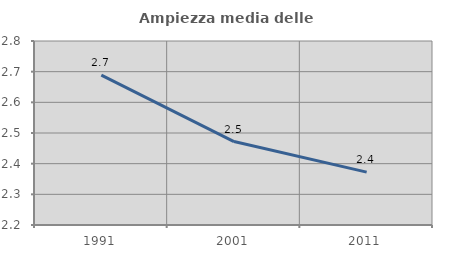
| Category | Ampiezza media delle famiglie |
|---|---|
| 1991.0 | 2.689 |
| 2001.0 | 2.472 |
| 2011.0 | 2.372 |